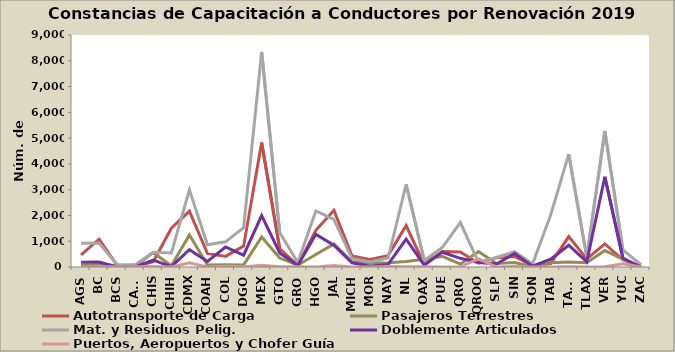
| Category | Autotransporte de Carga | Pasajeros Terrestres | Mat. y Residuos Pelig. | Doblemente Articulados | Puertos, Aeropuertos y Chofer Guía |
|---|---|---|---|---|---|
| AGS | 470 | 60 | 919 | 182 | 4 |
| BC | 1077 | 86 | 934 | 196 | 11 |
| BCS | 66 | 57 | 90 | 0 | 13 |
| CAMP | 27 | 33 | 87 | 0 | 12 |
| CHIS | 208 | 556 | 572 | 265 | 15 |
| CHIH | 1505 | 48 | 543 | 12 | 1 |
| CDMX | 2169 | 1243 | 2996 | 669 | 159 |
| COAH | 523 | 79 | 861 | 216 | 0 |
| COL | 411 | 86 | 977 | 777 | 27 |
| DGO | 809 | 81 | 1522 | 458 | 5 |
| MEX | 4828 | 1165 | 8344 | 1995 | 70 |
| GTO | 707 | 348 | 1334 | 546 | 8 |
| GRO | 61 | 71 | 173 | 60 | 5 |
| HGO | 1421 | 483 | 2174 | 1266 | 1 |
| JAL | 2200 | 894 | 1848 | 844 | 57 |
| MICH | 432 | 203 | 329 | 163 | 0 |
| MOR | 292 | 150 | 192 | 33 | 1 |
| NAY | 441 | 164 | 347 | 102 | 15 |
| NL | 1608 | 216 | 3203 | 1085 | 5 |
| OAX | 96 | 303 | 255 | 72 | 6 |
| PUE | 602 | 416 | 756 | 571 | 2 |
| QRO | 582 | 111 | 1725 | 337 | 9 |
| QROO | 148 | 601 | 187 | 177 | 317 |
| SLP | 363 | 139 | 369 | 115 | 3 |
| SIN | 407 | 173 | 593 | 523 | 19 |
| SON | 49 | 13 | 121 | 34 | 0 |
| TAB | 129 | 161 | 2017 | 307 | 3 |
| TAMS | 1181 | 196 | 4370 | 845 | 5 |
| TLAX | 317 | 165 | 389 | 203 | 1 |
| VER | 897 | 637 | 5277 | 3502 | 11 |
| YUC | 279 | 307 | 658 | 347 | 129 |
| ZAC | 0 | 0 | 88 | 0 | 0 |